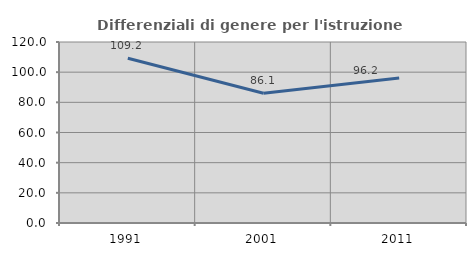
| Category | Differenziali di genere per l'istruzione superiore |
|---|---|
| 1991.0 | 109.217 |
| 2001.0 | 86.072 |
| 2011.0 | 96.179 |